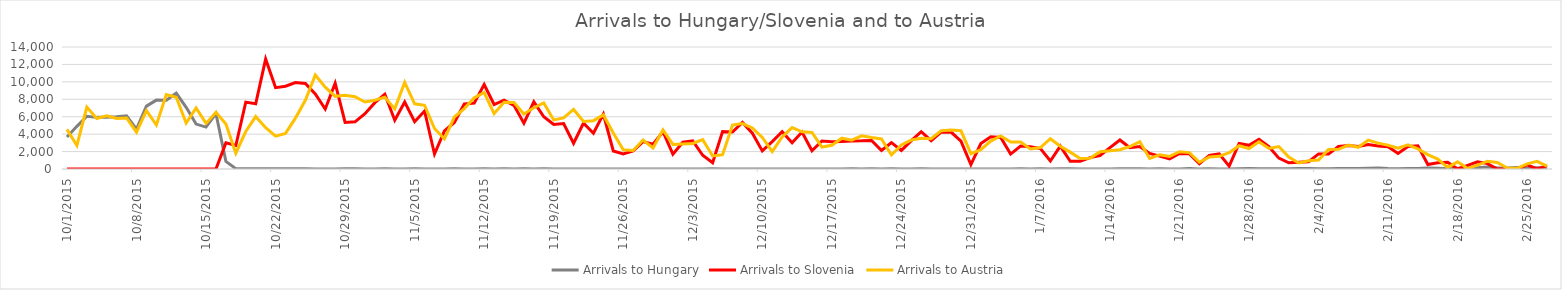
| Category | Arrivals to Hungary | Arrivals to Slovenia | Arrivals to Austria |
|---|---|---|---|
| 10/1/15 | 3667 | 0 | 4550 |
| 10/2/15 | 4897 | 0 | 2700 |
| 10/3/15 | 6056 | 0 | 7100 |
| 10/4/15 | 5925 | 0 | 5800 |
| 10/5/15 | 5952 | 0 | 6100 |
| 10/6/15 | 6000 | 0 | 5800 |
| 10/7/15 | 6103 | 0 | 5861 |
| 10/8/15 | 4583 | 6 | 4229 |
| 10/9/15 | 7215 | 0 | 6700 |
| 10/10/15 | 7907 | 0 | 5050 |
| 10/11/15 | 7897 | 0 | 8540 |
| 10/12/15 | 8702 | 0 | 8240 |
| 10/13/15 | 7081 | 0 | 5280 |
| 10/14/15 | 5157 | 0 | 7000 |
| 10/15/15 | 4808 | 0 | 5235 |
| 10/16/15 | 6353 | 0 | 6500 |
| 10/17/15 | 870 | 3000 | 5155 |
| 10/18/15 | 41 | 2700 | 1822 |
| 10/19/15 | 22 | 7677 | 4300 |
| 10/20/15 | 36 | 7478 | 6017 |
| 10/21/15 | 39 | 12616 | 4737 |
| 10/22/15 | 32 | 9339 | 3767 |
| 10/23/15 | 29 | 9500 | 4092 |
| 10/24/15 | 35 | 9925 | 5841 |
| 10/25/15 | 34 | 9818 | 7882 |
| 10/26/15 | 12 | 8625 | 10784 |
| 10/27/15 | 7 | 6877 | 9390 |
| 10/28/15 | 4 | 9848 | 8336 |
| 10/29/15 | 23 | 5341 | 8473 |
| 10/30/15 | 18 | 5409 | 8302 |
| 10/31/15 | 10 | 6344 | 7691 |
| 11/1/15 | 14 | 7611 | 7887 |
| 11/2/15 | 31 | 8568 | 8243 |
| 11/3/15 | 8 | 5591 | 6900 |
| 11/4/15 | 10 | 7693 | 9930 |
| 11/5/15 | 18 | 5426 | 7478 |
| 11/6/15 | 4 | 6655 | 7315 |
| 11/7/15 | 8 | 1716 | 4648 |
| 11/8/15 | 9 | 4381 | 3465 |
| 11/9/15 | 25 | 5341 | 5962 |
| 11/10/15 | 14 | 7457 | 6933 |
| 11/11/15 | 13 | 7554 | 8169 |
| 11/12/15 | 23 | 9681 | 8777 |
| 11/13/15 | 6 | 7397 | 6351 |
| 11/14/15 | 21 | 7905 | 7659 |
| 11/15/15 | 8 | 7300 | 7632 |
| 11/16/15 | 15 | 5261 | 6319 |
| 11/17/15 | 5 | 7704 | 7026 |
| 11/18/15 | 15 | 5998 | 7577 |
| 11/19/15 | 4 | 5119 | 5635 |
| 11/20/15 | 9 | 5211 | 5865 |
| 11/21/15 | 2 | 2952 | 6836 |
| 11/22/15 | 11 | 5260 | 5446 |
| 11/23/15 | 4 | 4102 | 5546 |
| 11/24/15 | 4 | 6297 | 6204 |
| 11/25/15 | 6 | 2070 | 4122 |
| 11/26/15 | 10 | 1742 | 2211 |
| 11/27/15 | 2 | 2065 | 2120 |
| 11/28/15 | 6 | 3139 | 3320 |
| 11/29/15 | 3 | 2843 | 2407 |
| 11/30/15 | 7 | 4274 | 4482 |
| 12/1/15 | 4 | 1709 | 2821 |
| 12/2/15 | 4 | 3077 | 2874 |
| 12/3/15 | 9 | 3237 | 2935 |
| 12/4/15 | 1 | 1577 | 3366 |
| 12/5/15 | 31 | 715 | 1493 |
| 12/6/15 | 7 | 4288 | 1643 |
| 12/7/15 | 0 | 4240 | 5035 |
| 12/8/15 | 13 | 5351 | 5210 |
| 12/9/15 | 14 | 4103 | 4714 |
| 12/10/15 | 3 | 2078 | 3623 |
| 12/11/15 | 0 | 3149 | 2000 |
| 12/12/15 | 13 | 4271 | 3675 |
| 12/13/15 | 10 | 3016 | 4754 |
| 12/14/15 | 3 | 4250 | 4263 |
| 12/15/15 | 2 | 2098 | 4193 |
| 12/16/15 | 6 | 3214 | 2519 |
| 12/17/15 | 0 | 3135 | 2717 |
| 12/18/15 | 11 | 3150 | 3532 |
| 12/19/15 | 31 | 3222 | 3305 |
| 12/20/15 | 8 | 3233 | 3800 |
| 12/21/15 | 25 | 3278 | 3611 |
| 12/22/15 | 1 | 2118 | 3451 |
| 12/23/15 | 21 | 3030 | 1613 |
| 12/24/15 | 8 | 2131 | 2764 |
| 12/25/15 | 2 | 3257 | 3321 |
| 12/26/15 | 17 | 4274 | 3532 |
| 12/27/15 | 10 | 3253 | 3476 |
| 12/28/15 | 0 | 4228 | 4394 |
| 12/29/15 | 0 | 4239 | 4468 |
| 12/30/15 | 11 | 3195 | 4386 |
| 12/31/15 | 5 | 511 | 1756 |
| 1/1/16 | 0 | 2914 | 2226 |
| 1/2/16 | 0 | 3690 | 3199 |
| 1/3/16 | 0 | 3619 | 3793 |
| 1/4/16 | 0 | 1708 | 3085 |
| 1/5/16 | 18 | 2626 | 3091 |
| 1/6/16 | 5 | 2550 | 2299 |
| 1/7/16 | 31 | 2337 | 2466 |
| 1/8/16 | 0 | 916 | 3472 |
| 1/9/16 | 15 | 2630 | 2619 |
| 1/10/16 | 28 | 880 | 1934 |
| 1/11/16 | 7 | 897 | 1204 |
| 1/12/16 | 2 | 1308 | 1231 |
| 1/13/16 | 0 | 1544 | 1991 |
| 1/14/16 | 4 | 2449 | 2082 |
| 1/15/16 | 30 | 3330 | 2219 |
| 1/16/16 | 30 | 2435 | 2578 |
| 1/17/16 | 30 | 2570 | 3141 |
| 1/18/16 | 9 | 1783 | 1203 |
| 1/19/16 | 29 | 1476 | 1630 |
| 1/20/16 | 0 | 1154 | 1439 |
| 1/21/16 | 10 | 1787 | 1989 |
| 1/22/16 | 47 | 1738 | 1885 |
| 1/23/16 | 10 | 606 | 777 |
| 1/24/16 | 15 | 1564 | 1366 |
| 1/25/16 | 5 | 1746 | 1450 |
| 1/26/16 | 4 | 326 | 1867 |
| 1/27/16 | 36 | 2935 | 2670 |
| 1/28/16 | 51 | 2719 | 2340 |
| 1/29/16 | 38 | 3416 | 3121 |
| 1/30/16 | 38 | 2556 | 2351 |
| 1/31/16 | 38 | 1249 | 2579 |
| 2/1/16 | 31 | 716 | 1367 |
| 2/2/16 | 69 | 765 | 690 |
| 2/3/16 | 46 | 841 | 937 |
| 2/4/16 | 31 | 1733 | 1026 |
| 2/5/16 | 19 | 1713 | 2235 |
| 2/6/16 | 49 | 2580 | 2252 |
| 2/7/16 | 53 | 2694 | 2737 |
| 2/8/16 | 48 | 2582 | 2490 |
| 2/9/16 | 72 | 2805 | 3314 |
| 2/10/16 | 104 | 2637 | 2968 |
| 2/11/16 | 54 | 2547 | 2731 |
| 2/12/16 | 39 | 1774 | 2378 |
| 2/13/16 | 66 | 2576 | 2781 |
| 2/14/16 | 51 | 2660 | 2301 |
| 2/15/16 | 119 | 516 | 1651 |
| 2/16/16 | 93 | 715 | 1143 |
| 2/17/16 | 34 | 769 | 181 |
| 2/18/16 | 73 | 0 | 817 |
| 2/19/16 | 113 | 408 | 50 |
| 2/20/16 | 151 | 828 | 453 |
| 2/21/16 | 237 | 623 | 899 |
| 2/22/16 | 103 | 0 | 744 |
| 2/23/16 | 112 | 0 | 111 |
| 2/24/16 | 166 | 0 | 75 |
| 2/25/16 | 76 | 478 | 583 |
| 2/26/16 | 140 | 0 | 874 |
| 2/27/16 | 111 | 382 | 321 |